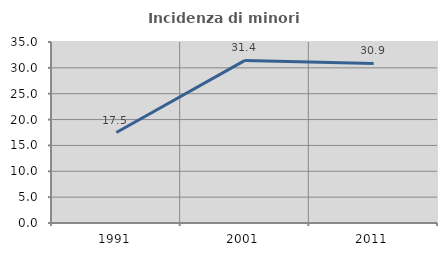
| Category | Incidenza di minori stranieri |
|---|---|
| 1991.0 | 17.5 |
| 2001.0 | 31.438 |
| 2011.0 | 30.866 |